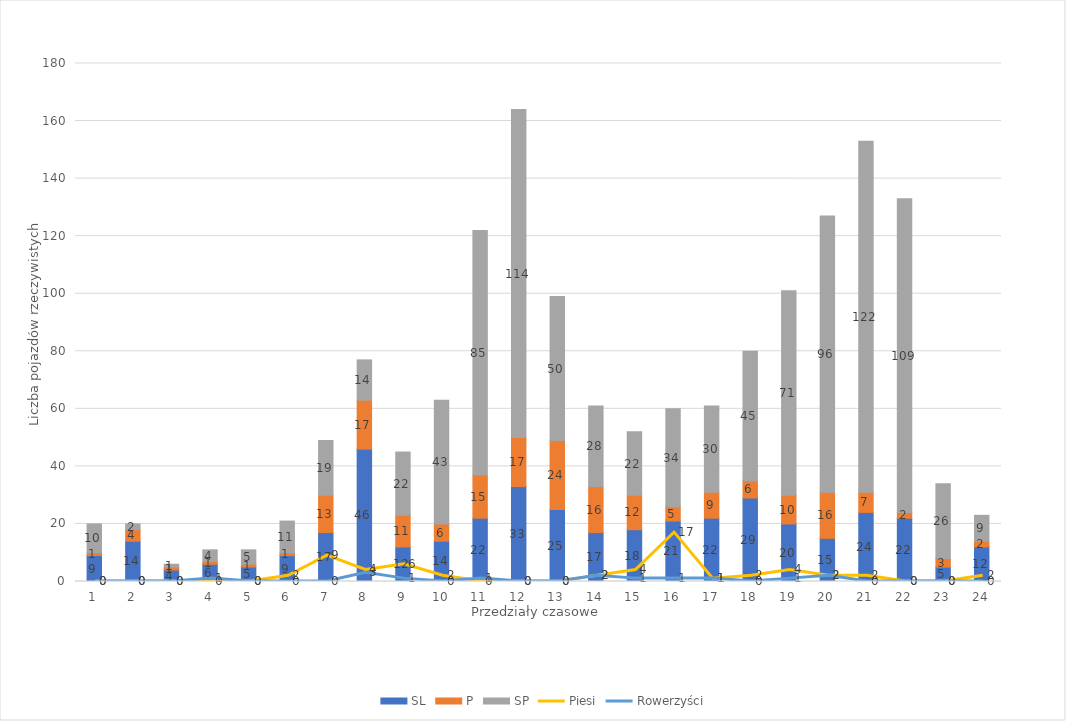
| Category | SL | P | SP |
|---|---|---|---|
| 0 | 9 | 1 | 10 |
| 1 | 14 | 4 | 2 |
| 2 | 4 | 1 | 1 |
| 3 | 6 | 1 | 4 |
| 4 | 5 | 1 | 5 |
| 5 | 9 | 1 | 11 |
| 6 | 17 | 13 | 19 |
| 7 | 46 | 17 | 14 |
| 8 | 12 | 11 | 22 |
| 9 | 14 | 6 | 43 |
| 10 | 22 | 15 | 85 |
| 11 | 33 | 17 | 114 |
| 12 | 25 | 24 | 50 |
| 13 | 17 | 16 | 28 |
| 14 | 18 | 12 | 22 |
| 15 | 21 | 5 | 34 |
| 16 | 22 | 9 | 30 |
| 17 | 29 | 6 | 45 |
| 18 | 20 | 10 | 71 |
| 19 | 15 | 16 | 96 |
| 20 | 24 | 7 | 122 |
| 21 | 22 | 2 | 109 |
| 22 | 5 | 3 | 26 |
| 23 | 12 | 2 | 9 |